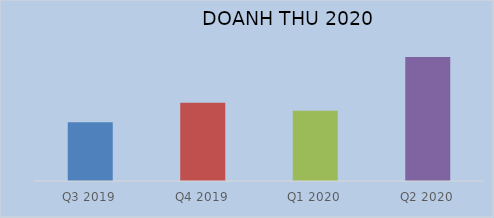
| Category | Series 0 |
|---|---|
| Q3 2019 | 2055637295525 |
| Q4 2019 | 2734919747881 |
| Q1 2020 | 2459973337717 |
| Q2 2020 | 4337030110415 |